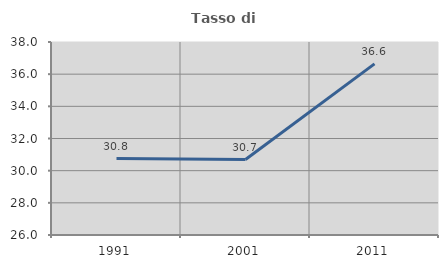
| Category | Tasso di occupazione   |
|---|---|
| 1991.0 | 30.752 |
| 2001.0 | 30.693 |
| 2011.0 | 36.641 |